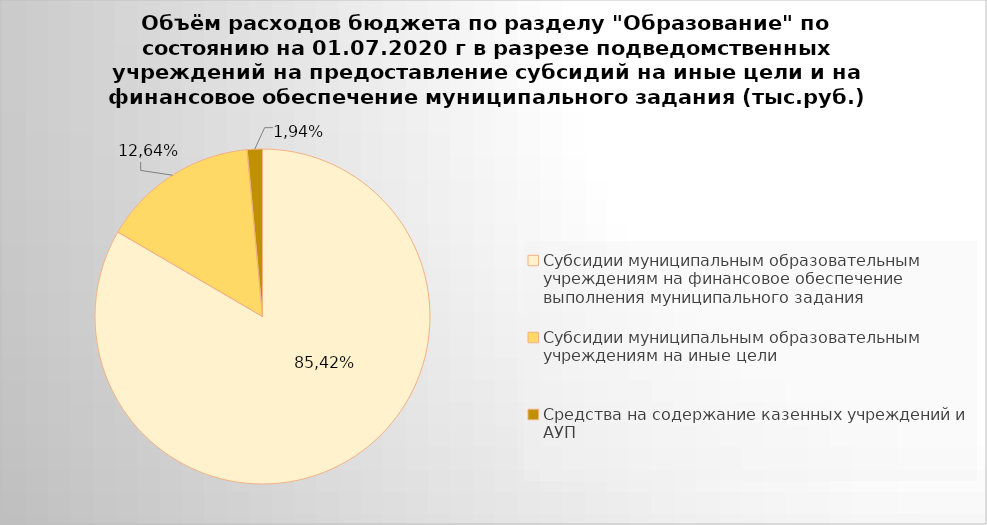
| Category | Series 0 |
|---|---|
| Субсидии муниципальным образовательным учреждениям на финансовое обеспечение выполнения муниципального задания | 4942295.82 |
| Субсидии муниципальным образовательным учреждениям на иные цели | 896072.71 |
| Средства на содержание казенных учреждений и АУП | 86831.82 |